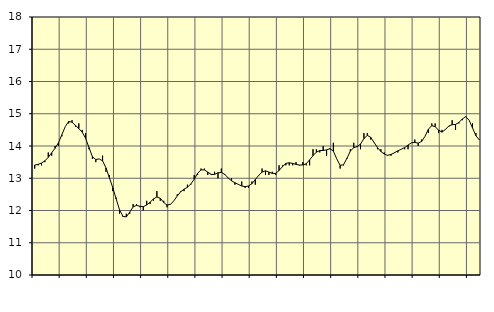
| Category | Piggar | Handel, SNI 45-47 |
|---|---|---|
| nan | 13.3 | 13.41 |
| 87.0 | 13.4 | 13.43 |
| 87.0 | 13.4 | 13.47 |
| 87.0 | 13.5 | 13.54 |
| nan | 13.8 | 13.65 |
| 88.0 | 13.7 | 13.79 |
| 88.0 | 14 | 13.93 |
| 88.0 | 14 | 14.1 |
| nan | 14.3 | 14.35 |
| 89.0 | 14.6 | 14.6 |
| 89.0 | 14.7 | 14.76 |
| 89.0 | 14.8 | 14.74 |
| nan | 14.6 | 14.64 |
| 90.0 | 14.7 | 14.54 |
| 90.0 | 14.5 | 14.43 |
| 90.0 | 14.4 | 14.24 |
| nan | 13.9 | 13.95 |
| 91.0 | 13.6 | 13.67 |
| 91.0 | 13.5 | 13.58 |
| 91.0 | 13.6 | 13.6 |
| nan | 13.7 | 13.54 |
| 92.0 | 13.2 | 13.32 |
| 92.0 | 13.1 | 13.02 |
| 92.0 | 12.6 | 12.71 |
| nan | 12.4 | 12.36 |
| 93.0 | 11.9 | 12.02 |
| 93.0 | 11.8 | 11.82 |
| 93.0 | 11.9 | 11.8 |
| nan | 11.9 | 11.95 |
| 94.0 | 12.2 | 12.11 |
| 94.0 | 12.2 | 12.16 |
| 94.0 | 12.1 | 12.13 |
| nan | 12 | 12.12 |
| 95.0 | 12.3 | 12.17 |
| 95.0 | 12.2 | 12.26 |
| 95.0 | 12.3 | 12.36 |
| nan | 12.6 | 12.42 |
| 96.0 | 12.3 | 12.38 |
| 96.0 | 12.3 | 12.25 |
| 96.0 | 12.1 | 12.17 |
| nan | 12.2 | 12.19 |
| 97.0 | 12.3 | 12.3 |
| 97.0 | 12.5 | 12.45 |
| 97.0 | 12.6 | 12.58 |
| nan | 12.6 | 12.66 |
| 98.0 | 12.8 | 12.72 |
| 98.0 | 12.8 | 12.82 |
| 98.0 | 13.1 | 12.97 |
| nan | 13.1 | 13.15 |
| 99.0 | 13.3 | 13.26 |
| 99.0 | 13.3 | 13.26 |
| 99.0 | 13.1 | 13.19 |
| nan | 13.1 | 13.12 |
| 0.0 | 13.2 | 13.12 |
| 0.0 | 13 | 13.17 |
| 0.0 | 13.3 | 13.18 |
| nan | 13.1 | 13.12 |
| 1.0 | 13 | 13.01 |
| 1.0 | 13 | 12.92 |
| 1.0 | 12.8 | 12.86 |
| nan | 12.8 | 12.81 |
| 2.0 | 12.9 | 12.76 |
| 2.0 | 12.7 | 12.74 |
| 2.0 | 12.7 | 12.76 |
| nan | 12.9 | 12.83 |
| 3.0 | 12.8 | 12.96 |
| 3.0 | 13.1 | 13.09 |
| 3.0 | 13.3 | 13.19 |
| nan | 13.1 | 13.23 |
| 4.0 | 13.1 | 13.19 |
| 4.0 | 13.2 | 13.15 |
| 4.0 | 13.1 | 13.15 |
| nan | 13.4 | 13.24 |
| 5.0 | 13.4 | 13.36 |
| 5.0 | 13.4 | 13.46 |
| 5.0 | 13.4 | 13.48 |
| nan | 13.4 | 13.46 |
| 6.0 | 13.5 | 13.43 |
| 6.0 | 13.4 | 13.41 |
| 6.0 | 13.5 | 13.41 |
| nan | 13.4 | 13.45 |
| 7.0 | 13.4 | 13.57 |
| 7.0 | 13.9 | 13.7 |
| 7.0 | 13.9 | 13.81 |
| nan | 13.8 | 13.86 |
| 8.0 | 14 | 13.86 |
| 8.0 | 13.7 | 13.88 |
| 8.0 | 13.9 | 13.92 |
| nan | 14.1 | 13.84 |
| 9.0 | 13.6 | 13.6 |
| 9.0 | 13.3 | 13.4 |
| 9.0 | 13.4 | 13.42 |
| nan | 13.6 | 13.62 |
| 10.0 | 13.9 | 13.84 |
| 10.0 | 14.1 | 13.95 |
| 10.0 | 14 | 13.98 |
| nan | 13.9 | 14.06 |
| 11.0 | 14.4 | 14.23 |
| 11.0 | 14.4 | 14.33 |
| 11.0 | 14.2 | 14.27 |
| nan | 14.1 | 14.11 |
| 12.0 | 13.9 | 13.95 |
| 12.0 | 13.9 | 13.83 |
| 12.0 | 13.8 | 13.75 |
| nan | 13.7 | 13.71 |
| 13.0 | 13.7 | 13.74 |
| 13.0 | 13.8 | 13.79 |
| 13.0 | 13.8 | 13.85 |
| nan | 13.9 | 13.9 |
| 14.0 | 13.9 | 13.95 |
| 14.0 | 13.9 | 14.03 |
| 14.0 | 14.1 | 14.1 |
| nan | 14.2 | 14.11 |
| 15.0 | 14 | 14.09 |
| 15.0 | 14.2 | 14.14 |
| 15.0 | 14.3 | 14.3 |
| nan | 14.4 | 14.52 |
| 16.0 | 14.7 | 14.63 |
| 16.0 | 14.7 | 14.6 |
| 16.0 | 14.4 | 14.49 |
| nan | 14.5 | 14.43 |
| 17.0 | 14.5 | 14.51 |
| 17.0 | 14.6 | 14.62 |
| 17.0 | 14.8 | 14.66 |
| nan | 14.5 | 14.67 |
| 18.0 | 14.7 | 14.73 |
| 18.0 | 14.8 | 14.84 |
| 18.0 | 14.9 | 14.91 |
| nan | 14.8 | 14.8 |
| 19.0 | 14.7 | 14.56 |
| 19.0 | 14.4 | 14.32 |
| 19.0 | 14.2 | 14.19 |